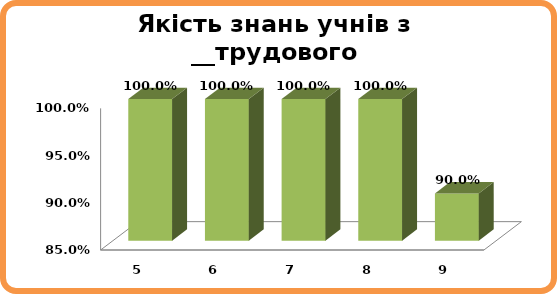
| Category | Series 0 |
|---|---|
| 5.0 | 1 |
| 6.0 | 1 |
| 7.0 | 1 |
| 8.0 | 1 |
| 9.0 | 0.9 |